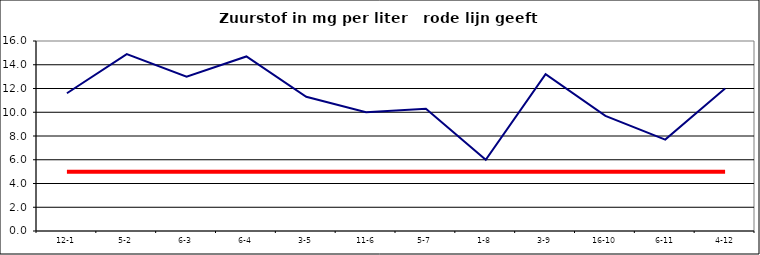
| Category | Series 0 | Series 1 |
|---|---|---|
| 12-1 | 11.6 | 5 |
| 5-2 | 14.9 | 5 |
| 6-3 | 13 | 5 |
| 6-4 | 14.7 | 5 |
| 3-5 | 11.3 | 5 |
| 11-6 | 10 | 5 |
| 5-7 | 10.3 | 5 |
| 1-8 | 6 | 5 |
| 3-9 | 13.2 | 5 |
| 16-10 | 9.7 | 5 |
| 6-11 | 7.7 | 5 |
| 4-12 | 12 | 5 |